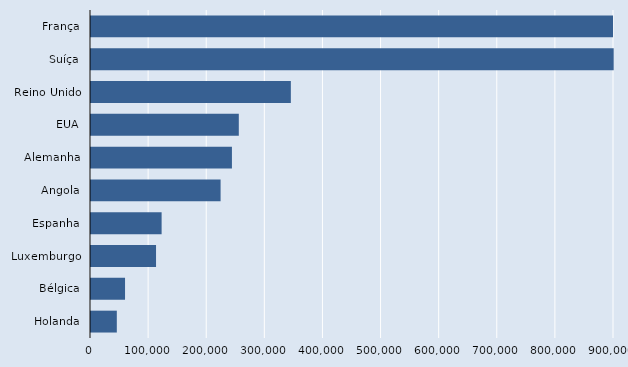
| Category | Series 2 |
|---|---|
| França | 1133290 |
| Suíça | 899460 |
| Reino Unido | 343900 |
| EUA | 254350 |
| Alemanha | 242520 |
| Angola | 223010 |
| Espanha | 121520 |
| Luxemburgo | 111910 |
| Bélgica | 58580 |
| Holanda | 44430 |